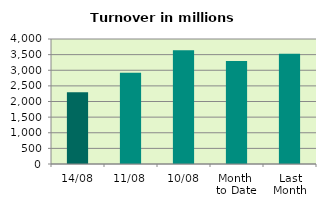
| Category | Series 0 |
|---|---|
| 14/08 | 2295.243 |
| 11/08 | 2916.384 |
| 10/08 | 3638.957 |
| Month 
to Date | 3295.134 |
| Last
Month | 3531.02 |